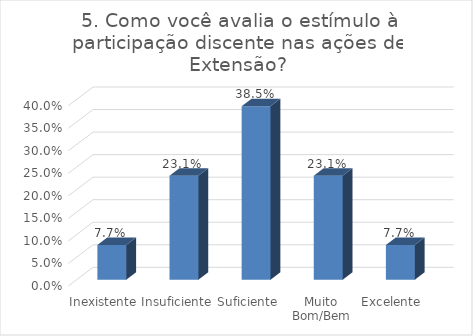
| Category | 5. Como você avalia o estímulo à participação discente nas ações de Extensão? |
|---|---|
| Inexistente | 0.077 |
| Insuficiente | 0.231 |
| Suficiente | 0.385 |
| Muito Bom/Bem | 0.231 |
| Excelente | 0.077 |